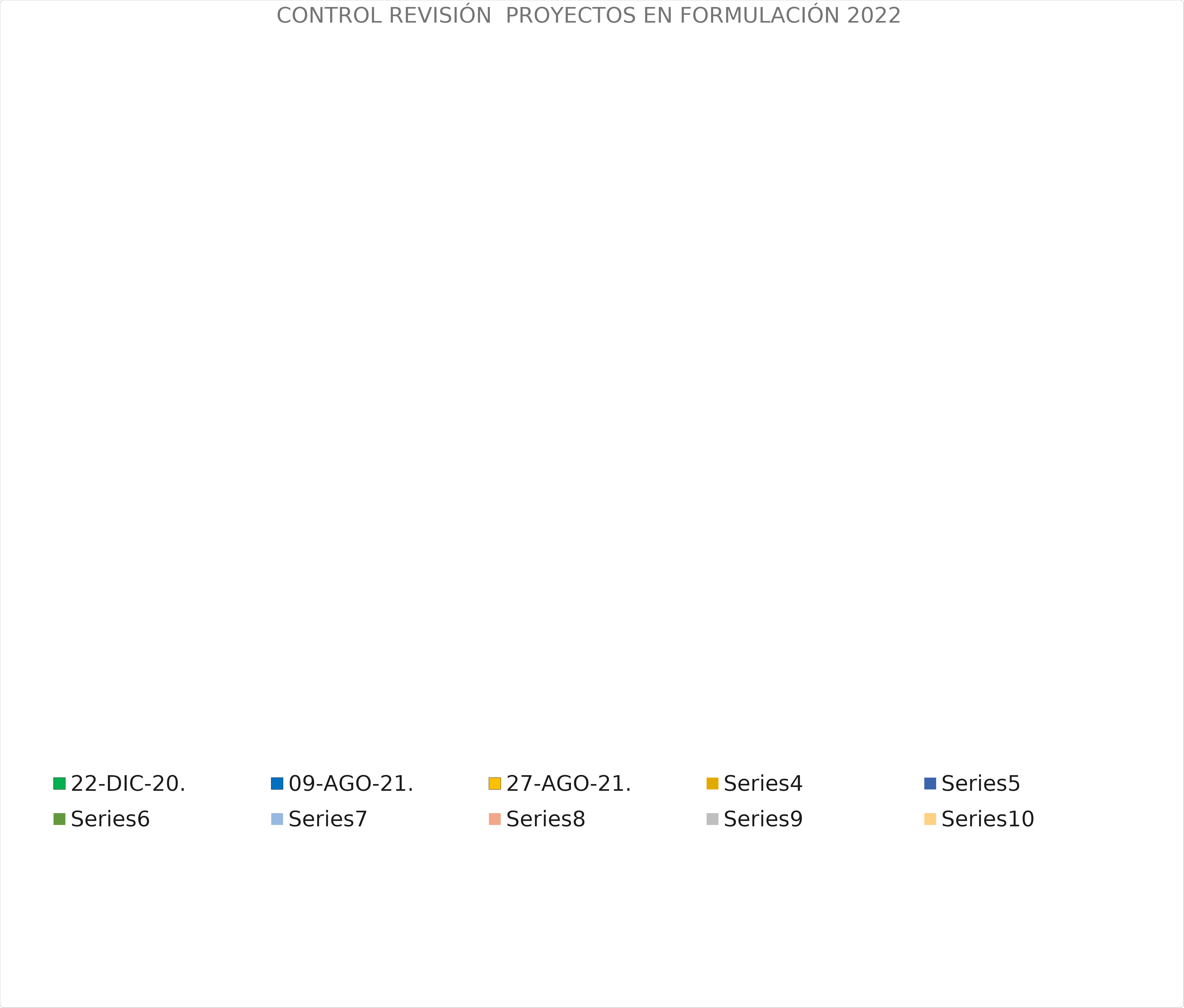
| Category | 22-DIC-20. | 09-AGO-21. | 27-AGO-21. | Series 3 | Series 4 | Series 5 | Series 6 | Series 7 | Series 8 | Series 9 |
|---|---|---|---|---|---|---|---|---|---|---|
| FORTALECIMIENTO A LA ESTRATEGIA DE ALIMENTACIÓN ESCOLAR PARA EL AÑO 2022 EN LOS MUNICIPIOS DEL DEPARTAMENTO DE CUNDINAMARCA | 0.261 | 0.299 |  |  |  |  |  |  |  | 0.299 |
| FORTALECIMIENTO A LA ESTRATEGIA DE  TRANSPORTE PARA EL AÑO 2022 EN LOS MUNICIPIOS DEL DEPARTAMENTO DE CUNDINAMARCA | 0.15 | 0.267 |  |  |  |  |  |  |  | 0.338 |
| DOTACIÓN DE MOBILIARIO EDUCATIVO | 0.15 | 0.206 |  |  |  |  |  |  |  | 0.206 |
| FORTALECIMIENTO A LA ESTRATEGIA DE ALIMENTACIÓN ESCOLAR PARA EL AÑO 2023 EN LOS MUNICIPIOS DEL DEPARTAMENTO DE CUNDINAMARCA | 0.15 | 0.15 |  |  |  |  |  |  |  | 0.15 |
| FORTALECIMIENTO A LA ESTRATEGIA DE  TRANSPORTE PARA EL AÑO 2023 EN LOS MUNICIPIOS DEL DEPARTAMENTO DE CUNDINAMARCA | 0.15 | 0.15 |  |  |  |  |  |  |  | 0.15 |
| SUBSIDIOS PARA LA CONEXIÓN DEL SERVICIO DE GAS DOMICILIARIO | 0 | 0 |  |  |  |  |  |  |  | 0.641 |
| INSTALACION DE REDES DE GAS DEL DEPARTAMENTO DE CUNDINAMARCA | 0 | 0 |  |  |  |  |  |  |  | 0.216 |
| AJUSTES A TRES PROYECTOS | 0 | 0 |  |  |  |  |  |  |  | 0.15 |
| ADQUISICIÓN DE MAQUINARIA VERDE PARA EL FORTALECIMIENTO DE LAS CADENAS PRODUCTIVAS DEL SECTOR AGRARIO EN CUNDINAMARCA | 0 | 0 |  |  |  |  |  |  |  | 0 |
| FORTALECIMIENTO A LA REACTIVACIÓN DE MIPYMES EN CUNDINAMARCA | 0.15 | 0.261 |  |  |  |  |  |  |  | 0.261 |
| INFLEXIBILIDAD | 0 | 0 |  |  |  |  |  |  |  | 0.15 |
| IMPLEMENTACIÓN DE VIVEROS FORESTALES  REGIONALES  | 0 | 0 |  |  |  |  |  |  |  | 0.33 |
| MEJORAMIENTO DE LA PRODUCTIVIDAD DE LA GANADERÍA DE CARNE Y LECHE PARA EL FORTALECIMIENTO PRODUCTIVO DE LAS PROVINCIAS DE RIONEGRO, MEDINA Y BAJO MAGDALENA DEL DEPARTAMENTO DE CUNDINAMARCA | 0 | 0 |  |  |  |  |  |  |  | 0.247 |
| FORTALECIMIENTO DE SISTEMAS PRODUCTIVOS A TRAVÉS DE MODELOS AGROFORESTALES DE CACAO EN EL DEPARTAMENTO DE CUNDINAMARCA
 | 0.205 | 0.205 |  |  |  |  |  |  |  | 0.305 |
| FORTALECIMIENTO DE LOS SISTEMAS PRODUCTIVOS AGRICOLAS A TRAVÉS DEL ESTABLECIMIENTO  DE CULTIVOS DE LIMÓN TAHITI Y AGUACATE HASS EN EL DEPARTAMENTO DE CUNDINAMARCA | 0 | 0 |  |  |  |  |  |  |  | 0.105 |
| MEJORAMIENTO DE LA PRODUCTIVIDAD DE LOS CULTIVOS DE CAÑA PANELERA EN EL DEPARTAMENTO DE CUNDINAMARCA | 0.234 | 0.234 |  |  |  |  |  |  |  | 0.317 |
| DEMARCACIÓN DEL CIRCUITO DE CICLO RUTAS EN MUNICIPIOS DEL DEPARTAMENTO DE CUNDINAMARCA | 0 | 0 |  |  |  |  |  |  |  | 0 |
| PAVIMENTACIÓN DE 4,2 KM DE LA VÍA QUE CONDUCEN DE NOCAIMA - NIMAIMA | 0 | 0 |  |  |  |  |  |  |  | 0.268 |
| CONSTRUCCION OBRAS DE MITIGACION EN MUNICIPIOS CON RIESGO EMINENTE DE AFECTACION DE INFRAESTRUCTURA | 0.15 | 0.15 |  |  |  |  |  |  |  | 0.15 |
| CONSTRUCCIÓN DEL FRIGORÍFICO NACIONAL DE ORIENTE EN EL MUNICIPIO DE CHIPAQUE,CUNDINAMARCA | 0.15 | 0.456 |  |  |  |  |  |  |  | 0.15 |